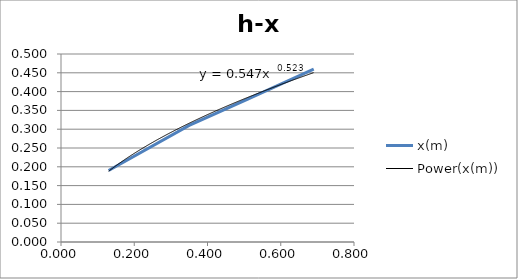
| Category | x(m) |
|---|---|
| 0.69 | 0.46 |
| 0.51 | 0.38 |
| 0.35 | 0.31 |
| 0.13 | 0.19 |